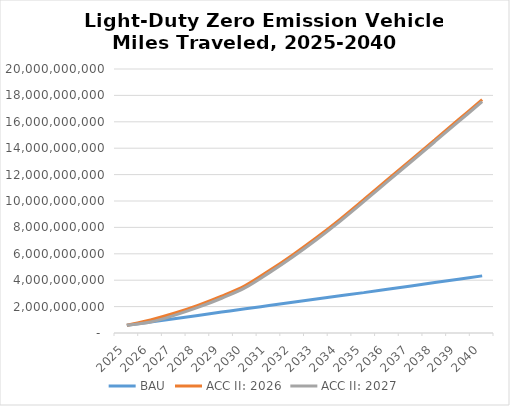
| Category | BAU | ACC II: 2026 | ACC II: 2027 |
|---|---|---|---|
| 2025.0 | 582442725.321 | 582442725.321 | 582442725.321 |
| 2026.0 | 832514014.453 | 991182692.53 | 832514014.453 |
| 2027.0 | 1082840560.487 | 1494811224.255 | 1336843165.522 |
| 2028.0 | 1333425492.292 | 2093881058.408 | 1936598408.742 |
| 2029.0 | 1584291883.458 | 2788964547.936 | 2632351050.032 |
| 2030.0 | 1835433747.691 | 3592566878.58 | 3436608446.259 |
| 2031.0 | 2079739678.813 | 4709994021.294 | 4555345256.933 |
| 2032.0 | 2324253717.884 | 5918640225.725 | 5765267257.998 |
| 2033.0 | 2569027856.364 | 7219412905.755 | 7067283786.047 |
| 2034.0 | 2814106199.651 | 8613214028.744 | 8462298696.609 |
| 2035.0 | 3059569206.19 | 10101079666.01 | 9951347740.797 |
| 2036.0 | 3311835780.158 | 11610388038.872 | 11461486712.238 |
| 2037.0 | 3564740629.137 | 13122411455.725 | 12974321330.061 |
| 2038.0 | 3818336919.837 | 14637461243.434 | 14490162964.335 |
| 2039.0 | 4072608868.74 | 16155579223.014 | 16009056038.098 |
| 2040.0 | 4327656503.794 | 17677250491.233 | 17531483769.218 |